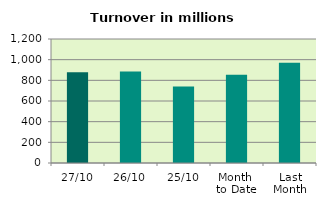
| Category | Series 0 |
|---|---|
| 27/10 | 878.273 |
| 26/10 | 885.336 |
| 25/10 | 740.975 |
| Month 
to Date | 853.327 |
| Last
Month | 970.98 |